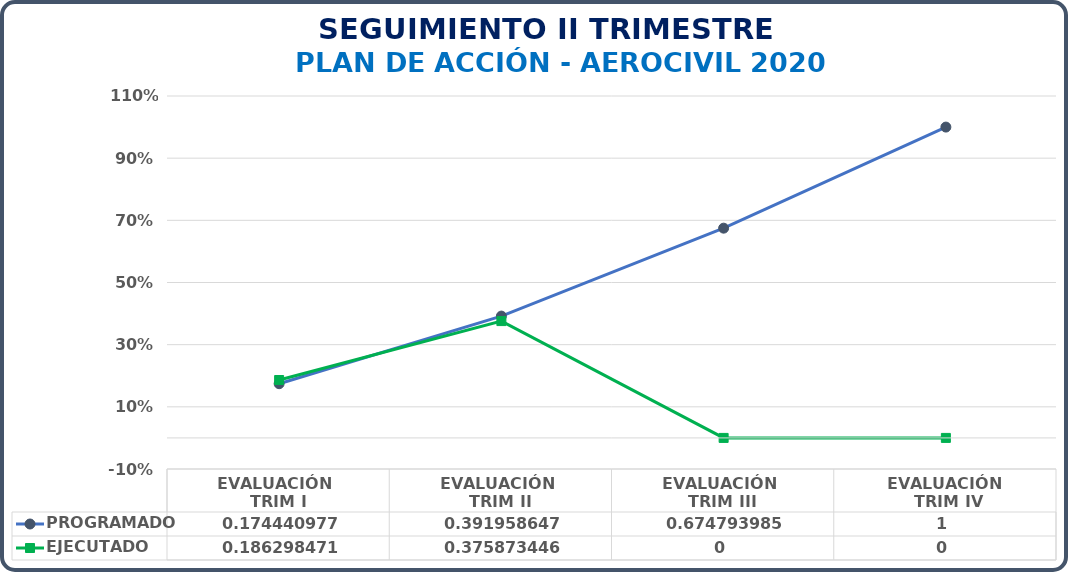
| Category | PROGRAMADO | EJECUTADO |
|---|---|---|
| EVALUACIÓN 
TRIM I | 0.174 | 0.186 |
| EVALUACIÓN 
TRIM II | 0.392 | 0.376 |
| EVALUACIÓN 
TRIM III | 0.675 | 0 |
| EVALUACIÓN
 TRIM IV | 1 | 0 |